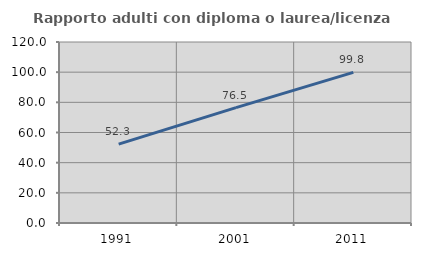
| Category | Rapporto adulti con diploma o laurea/licenza media  |
|---|---|
| 1991.0 | 52.319 |
| 2001.0 | 76.511 |
| 2011.0 | 99.83 |